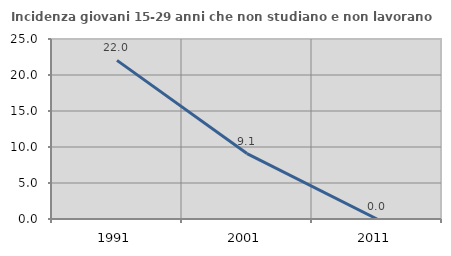
| Category | Incidenza giovani 15-29 anni che non studiano e non lavorano  |
|---|---|
| 1991.0 | 22.034 |
| 2001.0 | 9.091 |
| 2011.0 | 0 |